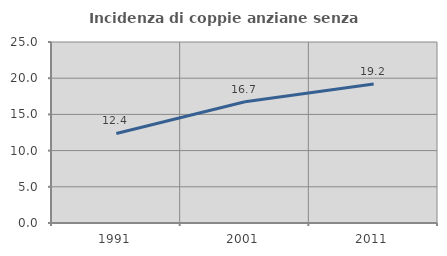
| Category | Incidenza di coppie anziane senza figli  |
|---|---|
| 1991.0 | 12.37 |
| 2001.0 | 16.743 |
| 2011.0 | 19.186 |